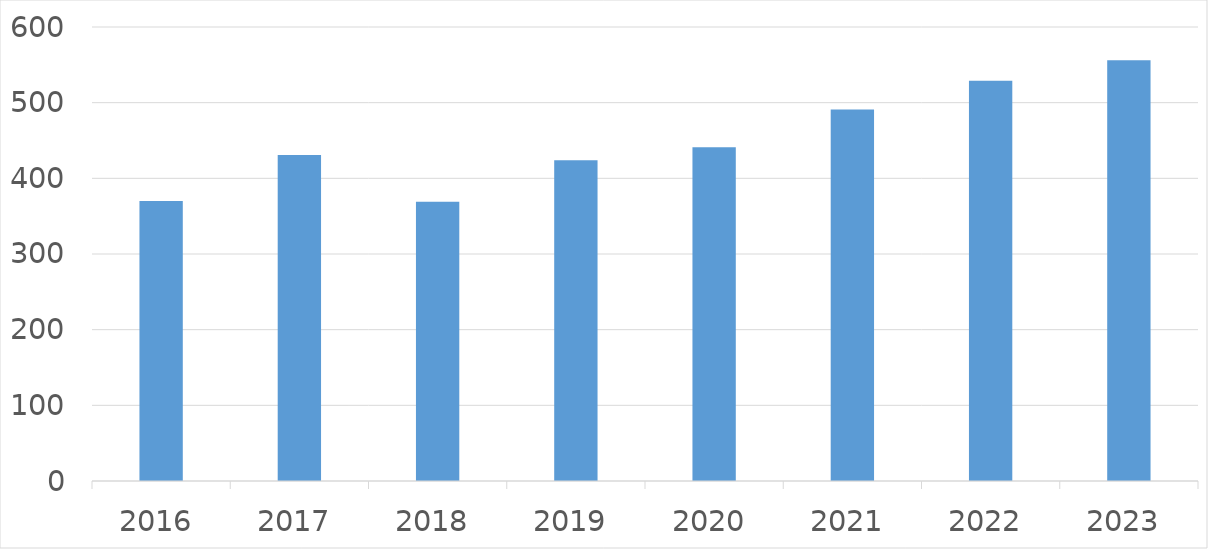
| Category | Series 0 |
|---|---|
| 2016 | 370 |
| 2017 | 431 |
| 2018 | 369 |
| 2019 | 424 |
| 2020 | 441 |
| 2021 | 491 |
| 2022 | 529 |
| 2023 | 556 |